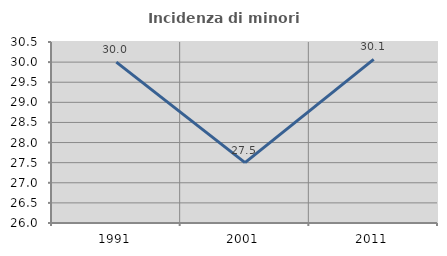
| Category | Incidenza di minori stranieri |
|---|---|
| 1991.0 | 30 |
| 2001.0 | 27.5 |
| 2011.0 | 30.07 |